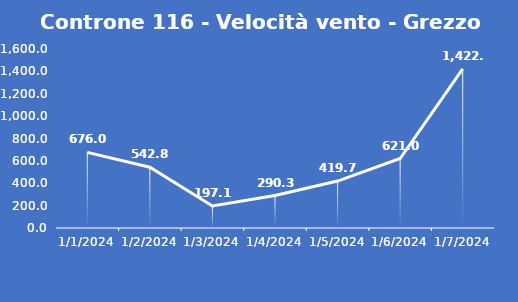
| Category | Controne 116 - Velocità vento - Grezzo (min) |
|---|---|
| 1/1/24 | 676 |
| 1/2/24 | 542.8 |
| 1/3/24 | 197.1 |
| 1/4/24 | 290.3 |
| 1/5/24 | 419.7 |
| 1/6/24 | 621 |
| 1/7/24 | 1422.2 |